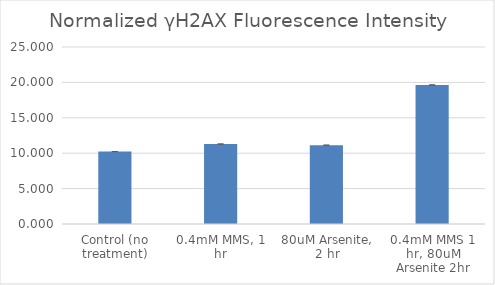
| Category | Series 0 |
|---|---|
| Control (no treatment) | 10.229 |
| 0.4mM MMS, 1 hr | 11.294 |
| 80uM Arsenite, 2 hr | 11.133 |
| 0.4mM MMS 1 hr, 80uM Arsenite 2hr | 19.638 |